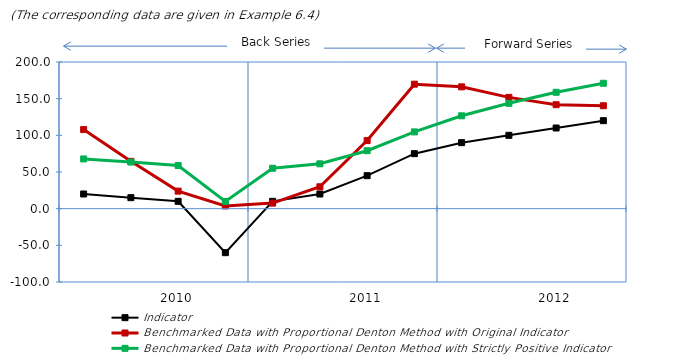
| Category | Indicator | Benchmarked Data with Proportional Denton Method with Original Indicator | Benchmarked Data with Proportional Denton Method with Strictly Positive Indicator |
|---|---|---|---|
| nan | 20 | 107.848 | 67.818 |
| nan | 15 | 64.524 | 63.565 |
| 2010.0 | 10 | 23.927 | 58.79 |
| nan | -60 | 3.701 | 9.827 |
| nan | 10 | 7.564 | 55.112 |
| nan | 20 | 29.843 | 61.156 |
| 2011.0 | 45 | 92.84 | 79.042 |
| nan | 75 | 169.752 | 104.691 |
| nan | 90 | 166.116 | 126.638 |
| nan | 100 | 151.759 | 143.694 |
| 2012.0 | 110 | 141.778 | 158.702 |
| nan | 120 | 140.348 | 170.966 |